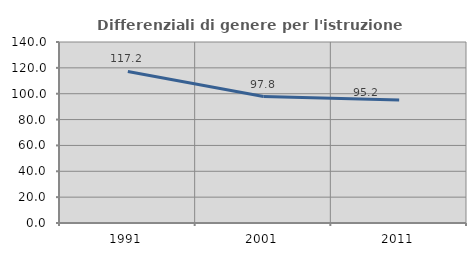
| Category | Differenziali di genere per l'istruzione superiore |
|---|---|
| 1991.0 | 117.245 |
| 2001.0 | 97.797 |
| 2011.0 | 95.175 |